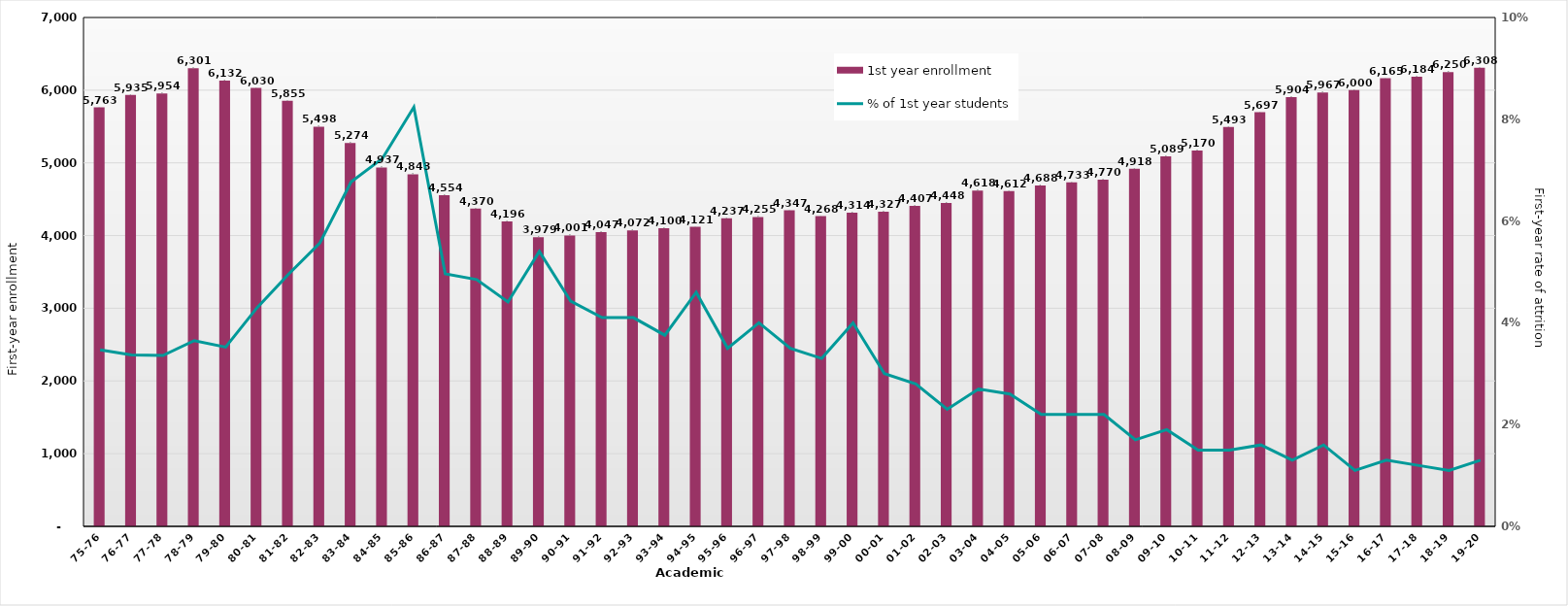
| Category | 1st year enrollment |
|---|---|
| 75-76 | 5763 |
| 76-77 | 5935 |
| 77-78 | 5954 |
| 78-79 | 6301 |
| 79-80 | 6132 |
| 80-81 | 6030 |
| 81-82 | 5855 |
| 82-83 | 5498 |
| 83-84 | 5274 |
| 84-85 | 4937 |
| 85-86 | 4843 |
| 86-87 | 4554 |
| 87-88 | 4370 |
| 88-89 | 4196 |
| 89-90 | 3979 |
| 90-91 | 4001 |
| 91-92 | 4047 |
| 92-93 | 4072 |
| 93-94 | 4100 |
| 94-95 | 4121 |
| 95-96 | 4237 |
| 96-97 | 4255 |
| 97-98 | 4347 |
| 98-99 | 4268 |
| 99-00 | 4314 |
| 00-01 | 4327 |
| 01-02 | 4407 |
| 02-03 | 4448 |
| 03-04 | 4618 |
| 04-05 | 4612 |
| 05-06 | 4688 |
| 06-07 | 4733 |
| 07-08 | 4770 |
| 08-09 | 4918 |
| 09-10 | 5089 |
| 10-11 | 5170 |
| 11-12 | 5493 |
| 12-13 | 5697 |
| 13-14 | 5904 |
| 14-15 | 5967 |
| 15-16 | 6000 |
| 16-17 | 6165 |
| 17-18 | 6184 |
| 18-19 | 6250 |
| 19-20 | 6308 |